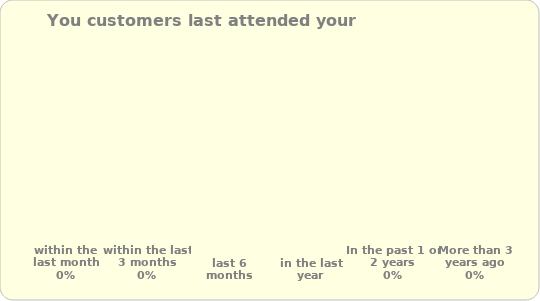
| Category | Series 0 |
|---|---|
| within the last month | 0 |
| within the last 3 months | 0 |
| last 6 months | 0 |
| in the last year | 0 |
| In the past 1 or 2 years | 0 |
| More than 3 years ago | 0 |